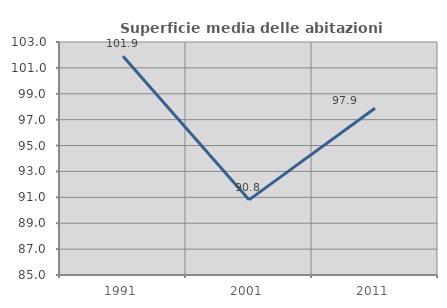
| Category | Superficie media delle abitazioni occupate |
|---|---|
| 1991.0 | 101.901 |
| 2001.0 | 90.805 |
| 2011.0 | 97.884 |